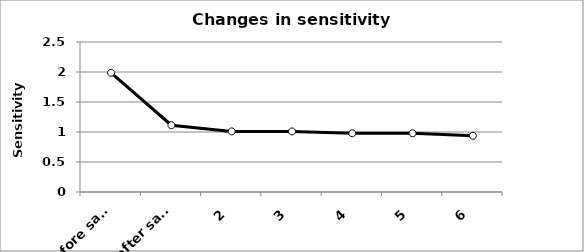
| Category | Sensitivity [V/µM] |
|---|---|
| 0 (before sample) | 1.987 |
| 1 (after sample) | 1.114 |
| 2 | 1.01 |
| 3 | 1.01 |
| 4 | 0.979 |
| 5 | 0.979 |
| 6 | 0.937 |